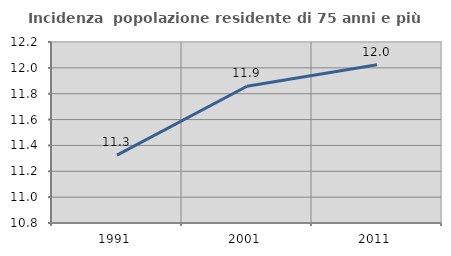
| Category | Incidenza  popolazione residente di 75 anni e più |
|---|---|
| 1991.0 | 11.325 |
| 2001.0 | 11.858 |
| 2011.0 | 12.023 |